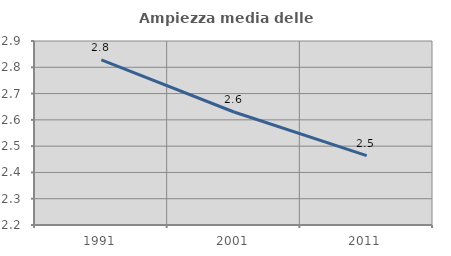
| Category | Ampiezza media delle famiglie |
|---|---|
| 1991.0 | 2.828 |
| 2001.0 | 2.63 |
| 2011.0 | 2.464 |